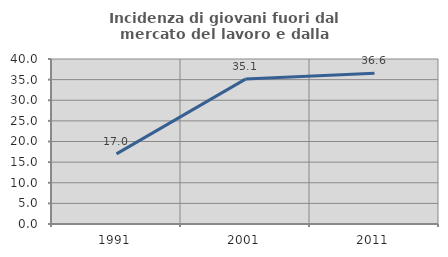
| Category | Incidenza di giovani fuori dal mercato del lavoro e dalla formazione  |
|---|---|
| 1991.0 | 17.011 |
| 2001.0 | 35.122 |
| 2011.0 | 36.562 |